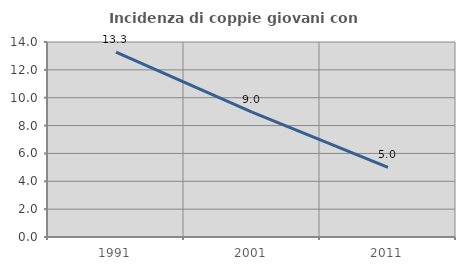
| Category | Incidenza di coppie giovani con figli |
|---|---|
| 1991.0 | 13.274 |
| 2001.0 | 8.962 |
| 2011.0 | 5 |